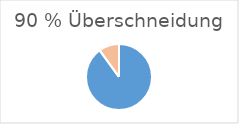
| Category | Series 0 |
|---|---|
| 0 | 90 |
| 1 | 10 |